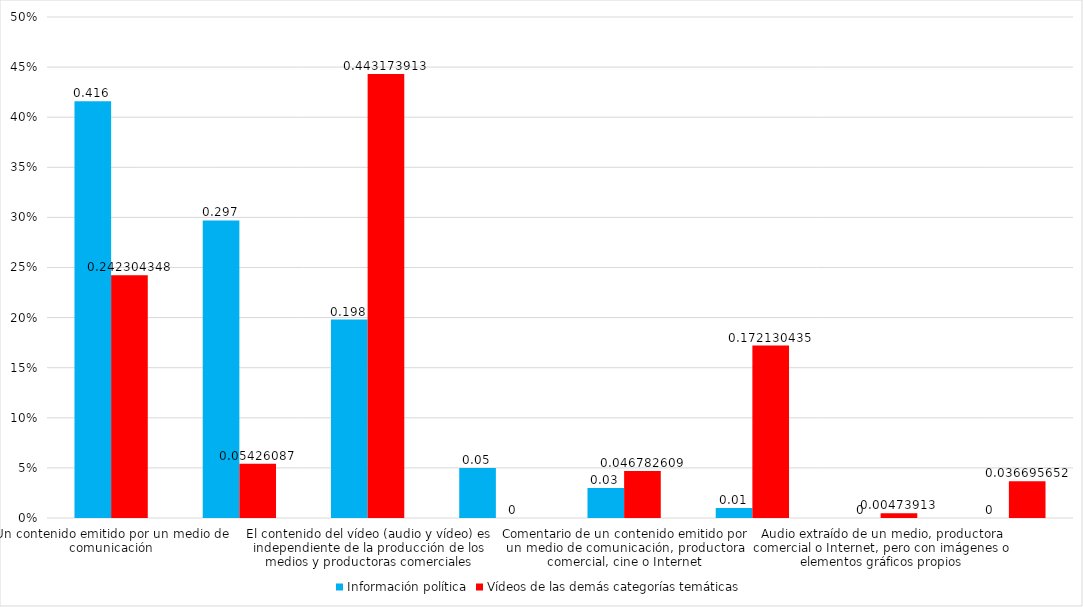
| Category | Información política | Vídeos de las demás categorías temáticas |
|---|---|---|
| Un contenido emitido por un medio de comunicación | 0.416 | 0.242 |
| Imágenes extraídas de un medio, productora comercial o Internet, pero con audio o elementos gráficos propios | 0.297 | 0.054 |
| El contenido del vídeo (audio y vídeo) es independiente de la producción de los medios y productoras comerciales | 0.198 | 0.443 |
| El contenido procede de una institución pública, que los pone a disposición del público de forma gratuita | 0.05 | 0 |
| Comentario de un contenido emitido por un medio de comunicación, productora comercial, cine o Internet | 0.03 | 0.047 |
| Una producción de una productora comercial | 0.01 | 0.172 |
| Audio extraído de un medio, productora comercial o Internet, pero con imágenes o elementos gráficos propios | 0 | 0.005 |
| Comentario de un videojuego | 0 | 0.037 |